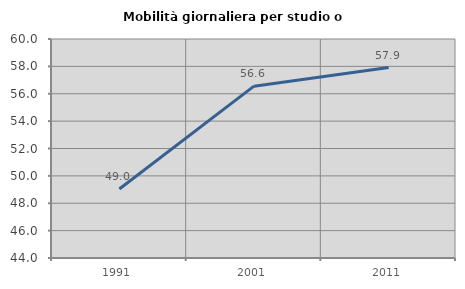
| Category | Mobilità giornaliera per studio o lavoro |
|---|---|
| 1991.0 | 49.045 |
| 2001.0 | 56.553 |
| 2011.0 | 57.915 |